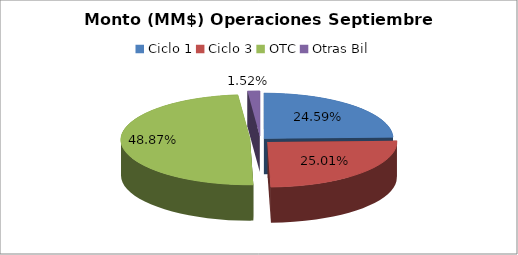
| Category | Series 0 |
|---|---|
| Ciclo 1 | 19897365.776 |
| Ciclo 3 | 20231545.747 |
| OTC | 39538700.233 |
| Otras Bil | 1232916.988 |